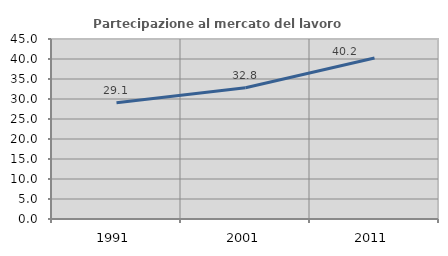
| Category | Partecipazione al mercato del lavoro  femminile |
|---|---|
| 1991.0 | 29.058 |
| 2001.0 | 32.804 |
| 2011.0 | 40.23 |